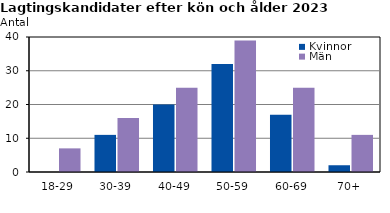
| Category | Kvinnor | Män |
|---|---|---|
| 18-29 | 0 | 7 |
| 30-39 | 11 | 16 |
| 40-49 | 20 | 25 |
| 50-59 | 32 | 39 |
| 60-69 | 17 | 25 |
| 70+ | 2 | 11 |